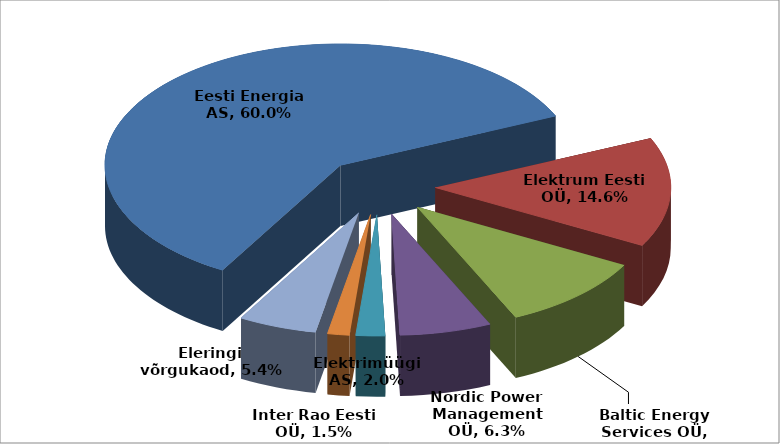
| Category | jaan.14 |
|---|---|
| Eesti Energia AS | 0.6 |
| Elektrum Eesti OÜ | 0.146 |
| Baltic Energy Services OÜ | 0.102 |
| Nordic Power Management OÜ | 0.063 |
| Elektrimüügi AS | 0.02 |
| Inter Rao Eesti OÜ | 0.015 |
| Eleringi võrgukaod | 0.054 |